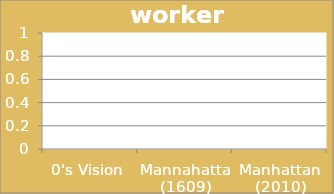
| Category | workers |
|---|---|
| 0's Vision | 0 |
| Mannahatta (1609) | 0 |
| Manhattan (2010) | 0 |